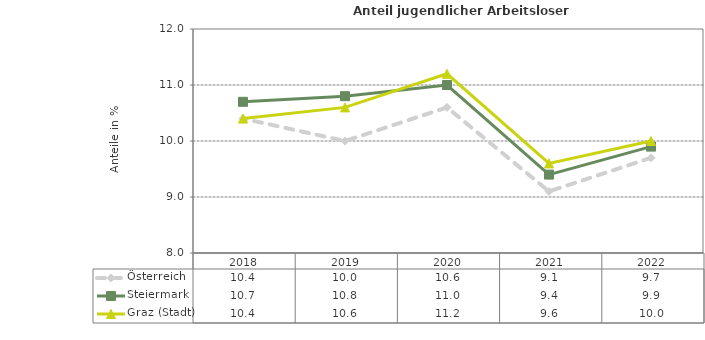
| Category | Österreich | Steiermark | Graz (Stadt) |
|---|---|---|---|
| 2022.0 | 9.7 | 9.9 | 10 |
| 2021.0 | 9.1 | 9.4 | 9.6 |
| 2020.0 | 10.6 | 11 | 11.2 |
| 2019.0 | 10 | 10.8 | 10.6 |
| 2018.0 | 10.4 | 10.7 | 10.4 |